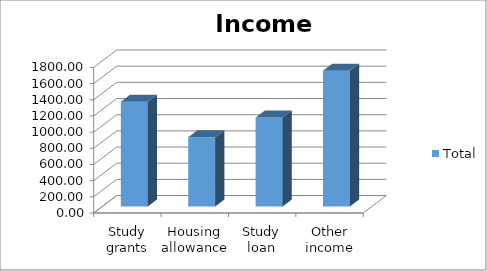
| Category | Total |
|---|---|
| Study grants | 1295 |
| Housing allowance | 857.75 |
| Study loan | 1100 |
| Other income | 1680 |